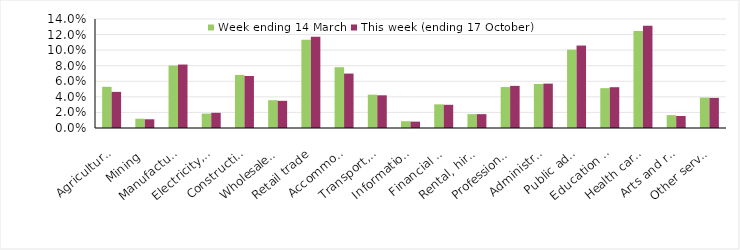
| Category | Week ending 14 March | This week (ending 17 October) |
|---|---|---|
| Agriculture, forestry and fishing | 0.053 | 0.046 |
| Mining | 0.012 | 0.011 |
| Manufacturing | 0.08 | 0.082 |
| Electricity, gas, water and waste services | 0.018 | 0.02 |
| Construction | 0.068 | 0.067 |
| Wholesale trade | 0.036 | 0.035 |
| Retail trade | 0.114 | 0.117 |
| Accommodation and food services | 0.078 | 0.07 |
| Transport, postal and warehousing | 0.043 | 0.042 |
| Information media and telecommunications | 0.009 | 0.008 |
| Financial and insurance services | 0.03 | 0.03 |
| Rental, hiring and real estate services | 0.018 | 0.018 |
| Professional, scientific and technical services | 0.053 | 0.054 |
| Administrative and support services | 0.056 | 0.057 |
| Public administration and safety | 0.101 | 0.106 |
| Education and training | 0.051 | 0.052 |
| Health care and social assistance | 0.124 | 0.131 |
| Arts and recreation services | 0.016 | 0.015 |
| Other services | 0.039 | 0.039 |